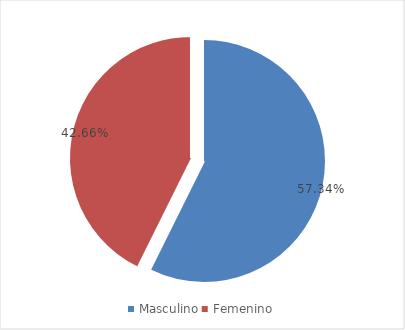
| Category | Series 0 |
|---|---|
| Masculino | 0.573 |
| Femenino | 0.427 |